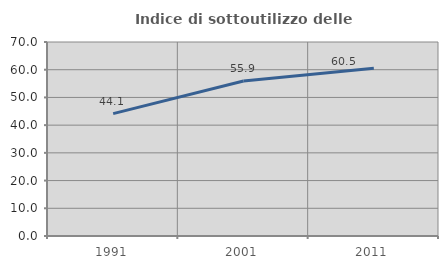
| Category | Indice di sottoutilizzo delle abitazioni  |
|---|---|
| 1991.0 | 44.141 |
| 2001.0 | 55.932 |
| 2011.0 | 60.526 |